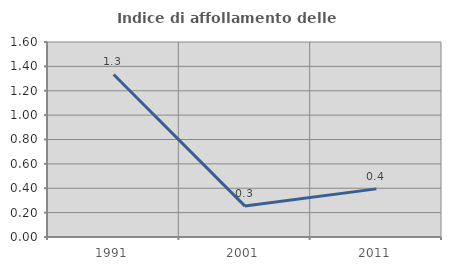
| Category | Indice di affollamento delle abitazioni  |
|---|---|
| 1991.0 | 1.334 |
| 2001.0 | 0.254 |
| 2011.0 | 0.395 |